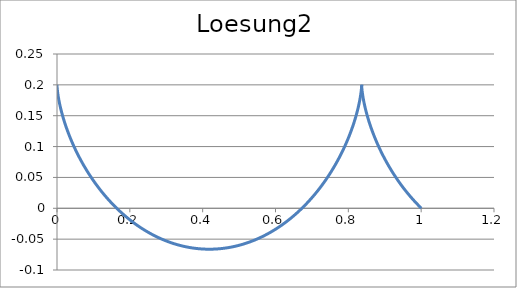
| Category | Loesung2 |
|---|---|
| 0.0 | 0.2 |
| 1.775264000021169e-07 | 0.2 |
| 1.420125989698755e-06 | 0.2 |
| 4.792445943709606e-06 | 0.2 |
| 1.1358281576902555e-05 | 0.2 |
| 2.218015084045884e-05 | 0.199 |
| 3.8318869328845375e-05 | 0.199 |
| 6.083312596773913e-05 | 0.199 |
| 9.077905955255315e-05 | 0.198 |
| 0.00012920983630701965 | 0.198 |
| 0.0001771752286307276 | 0.197 |
| 0.0002357211952041593 | 0.197 |
| 0.0003058894626191813 | 0.196 |
| 0.0003887171087022752 | 0.196 |
| 0.0004852361476972542 | 0.195 |
| 0.0005964731174733105 | 0.194 |
| 0.000723448668923555 | 0.193 |
| 0.0008671771577182861 | 0.192 |
| 0.001028666238576224 | 0.191 |
| 0.0012089164622160705 | 0.191 |
| 0.0014089208751495667 | 0.189 |
| 0.0016296646224761191 | 0.188 |
| 0.001872124553837883 | 0.187 |
| 0.0021372688326929696 | 0.186 |
| 0.0024260565490629243 | 0.185 |
| 0.0027394373359095506 | 0.184 |
| 0.00307835098929434 | 0.182 |
| 0.0034437270924726165 | 0.181 |
| 0.003836484644072635 | 0.18 |
| 0.004257531690508293 | 0.178 |
| 0.004707764962772832 | 0.177 |
| 0.005188069517758251 | 0.175 |
| 0.005699318384244411 | 0.174 |
| 0.006242372213699185 | 0.172 |
| 0.006818078936029271 | 0.17 |
| 0.0074272734204196365 | 0.169 |
| 0.008070777141396892 | 0.167 |
| 0.008749397850250458 | 0.165 |
| 0.00946392925194285 | 0.163 |
| 0.01021515068763823 | 0.162 |
| 0.011003826822976353 | 0.16 |
| 0.011830707342216529 | 0.158 |
| 0.012696526648373858 | 0.156 |
| 0.013602003569467884 | 0.154 |
| 0.014547841071000914 | 0.152 |
| 0.015534725974781224 | 0.15 |
| 0.01656332868420348 | 0.148 |
| 0.01763430291609631 | 0.145 |
| 0.018748285439244318 | 0.143 |
| 0.01990589581968904 | 0.141 |
| 0.02110773617291078 | 0.139 |
| 0.022354390922990457 | 0.137 |
| 0.02364642656884778 | 0.134 |
| 0.024984391457649194 | 0.132 |
| 0.02636881556547636 | 0.13 |
| 0.027800210285342783 | 0.127 |
| 0.02927906822264341 | 0.125 |
| 0.030805862998119046 | 0.122 |
| 0.03238104905841439 | 0.12 |
| 0.034005061494305405 | 0.118 |
| 0.03567831586666885 | 0.115 |
| 0.03740120804026339 | 0.113 |
| 0.03917411402538911 | 0.11 |
| 0.04099738982748824 | 0.108 |
| 0.04287137130474788 | 0.105 |
| 0.04479637403376107 | 0.102 |
| 0.046772693183300476 | 0.1 |
| 0.048800603396254714 | 0.097 |
| 0.05088035867977496 | 0.095 |
| 0.05301219230367537 | 0.092 |
| 0.05519631670712837 | 0.089 |
| 0.057432923413691724 | 0.087 |
| 0.059722182954701705 | 0.084 |
| 0.062064244801062866 | 0.082 |
| 0.06445923730346163 | 0.079 |
| 0.06690726764102771 | 0.076 |
| 0.06940842177846396 | 0.074 |
| 0.07196276443166155 | 0.071 |
| 0.07457033904181455 | 0.068 |
| 0.07723116775804398 | 0.066 |
| 0.07994525142853849 | 0.063 |
| 0.08271256960021504 | 0.06 |
| 0.08553308052689992 | 0.058 |
| 0.08840672118602673 | 0.055 |
| 0.09133340730384434 | 0.052 |
| 0.09431303338912551 | 0.05 |
| 0.09734547277536179 | 0.047 |
| 0.1004305776714286 | 0.044 |
| 0.10356817922069957 | 0.042 |
| 0.10675808756858698 | 0.039 |
| 0.11000009193848116 | 0.037 |
| 0.11329396071605814 | 0.034 |
| 0.11663944154192248 | 0.031 |
| 0.1200362614125475 | 0.029 |
| 0.12348412678947317 | 0.026 |
| 0.12698272371671757 | 0.024 |
| 0.13053171794635499 | 0.021 |
| 0.13413075507221078 | 0.019 |
| 0.13777946067161903 | 0.016 |
| 0.14147744045518656 | 0.014 |
| 0.14522428042450358 | 0.011 |
| 0.1490195470377375 | 0.009 |
| 0.15286278738304374 | 0.007 |
| 0.15675352935972464 | 0.004 |
| 0.16069128186706325 | 0.002 |
| 0.16467553500075716 | 0 |
| 0.16870576025687353 | -0.003 |
| 0.17278141074324335 | -0.005 |
| 0.17690192139821126 | -0.007 |
| 0.18106670921665252 | -0.009 |
| 0.18527517348316755 | -0.012 |
| 0.1895266960123596 | -0.014 |
| 0.19382064139610114 | -0.016 |
| 0.19815635725768832 | -0.018 |
| 0.20253317451278335 | -0.02 |
| 0.20695040763703873 | -0.022 |
| 0.21140735494029836 | -0.024 |
| 0.21590329884726395 | -0.026 |
| 0.22043750618451574 | -0.028 |
| 0.22500922847377205 | -0.03 |
| 0.22961770223127048 | -0.031 |
| 0.23426214927315148 | -0.033 |
| 0.23894177702672126 | -0.035 |
| 0.24365577884747047 | -0.037 |
| 0.24840333434172132 | -0.038 |
| 0.25318360969477377 | -0.04 |
| 0.25799575800442076 | -0.041 |
| 0.26283891961969735 | -0.043 |
| 0.26771222248473 | -0.044 |
| 0.27261478248754706 | -0.046 |
| 0.27754570381371185 | -0.047 |
| 0.2825040793046366 | -0.049 |
| 0.2874889908204336 | -0.05 |
| 0.292499509607159 | -0.051 |
| 0.29753469666830207 | -0.052 |
| 0.3025936031403711 | -0.054 |
| 0.3076752706724264 | -0.055 |
| 0.3127787318094077 | -0.056 |
| 0.3179030103791031 | -0.057 |
| 0.3230471218826058 | -0.058 |
| 0.32821007388809936 | -0.059 |
| 0.3333908664278179 | -0.059 |
| 0.3385884923980197 | -0.06 |
| 0.3438019379618154 | -0.061 |
| 0.349030182954689 | -0.062 |
| 0.35427220129255027 | -0.062 |
| 0.3595269613821545 | -0.063 |
| 0.36479342653372643 | -0.064 |
| 0.3700705553756218 | -0.064 |
| 0.3753573022708625 | -0.065 |
| 0.38065261773537745 | -0.065 |
| 0.385955448857782 | -0.065 |
| 0.3912647397205284 | -0.066 |
| 0.39657943182225913 | -0.066 |
| 0.40189846450119304 | -0.066 |
| 0.40722077535937584 | -0.066 |
| 0.41254530068762546 | -0.066 |
| 0.41787097589100114 | -0.066 |
| 0.4231967359146275 | -0.066 |
| 0.4285215156697021 | -0.066 |
| 0.43384425045951697 | -0.066 |
| 0.4391638764053229 | -0.066 |
| 0.44447933087186686 | -0.066 |
| 0.44978955289243183 | -0.065 |
| 0.45509348359320967 | -0.065 |
| 0.46039006661683596 | -0.065 |
| 0.46567824854491935 | -0.064 |
| 0.4709569793193947 | -0.064 |
| 0.4762252126625321 | -0.063 |
| 0.48148190649543443 | -0.063 |
| 0.48672602335485465 | -0.062 |
| 0.4919565308081677 | -0.061 |
| 0.4971724018663292 | -0.06 |
| 0.5023726153946577 | -0.06 |
| 0.5075561565212752 | -0.059 |
| 0.5127220170430418 | -0.058 |
| 0.5178691958288238 | -0.057 |
| 0.5229966992199332 | -0.056 |
| 0.528103541427577 | -0.055 |
| 0.5331887449271603 | -0.054 |
| 0.5382513408492832 | -0.053 |
| 0.5432903693672749 | -0.051 |
| 0.5483048800811123 | -0.05 |
| 0.5532939323975672 | -0.049 |
| 0.5582565959064305 | -0.047 |
| 0.5631919507526645 | -0.046 |
| 0.5680990880043325 | -0.045 |
| 0.5729771100161595 | -0.043 |
| 0.5778251307885777 | -0.042 |
| 0.5826422763221157 | -0.04 |
| 0.5874276849669859 | -0.038 |
| 0.5921805077677325 | -0.037 |
| 0.5968999088028034 | -0.035 |
| 0.6015850655189069 | -0.033 |
| 0.6062351690600224 | -0.032 |
| 0.6108494245909319 | -0.03 |
| 0.6154270516151434 | -0.028 |
| 0.6199672842870795 | -0.026 |
| 0.6244693717184048 | -0.024 |
| 0.6289325782783718 | -0.022 |
| 0.6333561838880629 | -0.02 |
| 0.6377394843084127 | -0.018 |
| 0.6420817914218945 | -0.016 |
| 0.646382433507757 | -0.014 |
| 0.6506407555107054 | -0.012 |
| 0.6548561193029127 | -0.01 |
| 0.6590279039392645 | -0.007 |
| 0.6631555059057267 | -0.005 |
| 0.6672383393607451 | -0.003 |
| 0.6712758363695721 | -0.001 |
| 0.6752674471314352 | 0.002 |
| 0.6792126401994477 | 0.004 |
| 0.6831109026931829 | 0.006 |
| 0.6869617405038165 | 0.009 |
| 0.6907646784917666 | 0.011 |
| 0.6945192606767407 | 0.013 |
| 0.6982250504201234 | 0.016 |
| 0.7018816305996247 | 0.018 |
| 0.7054886037761251 | 0.021 |
| 0.7090455923526435 | 0.023 |
| 0.7125522387253735 | 0.026 |
| 0.7160082054267184 | 0.028 |
| 0.7194131752602746 | 0.031 |
| 0.7227668514277054 | 0.034 |
| 0.726068957647457 | 0.036 |
| 0.7293192382652667 | 0.039 |
| 0.7325174583564218 | 0.041 |
| 0.7356634038197262 | 0.044 |
| 0.7387568814631377 | 0.047 |
| 0.7417977190810429 | 0.049 |
| 0.7447857655231361 | 0.052 |
| 0.7477208907548788 | 0.055 |
| 0.7506029859095105 | 0.057 |
| 0.7534319633315946 | 0.06 |
| 0.7562077566120793 | 0.063 |
| 0.7589303206148607 | 0.065 |
| 0.7615996314948357 | 0.068 |
| 0.7642156867074404 | 0.071 |
| 0.7667785050096683 | 0.073 |
| 0.7692881264525665 | 0.076 |
| 0.7717446123652172 | 0.079 |
| 0.7741480453302058 | 0.081 |
| 0.7764985291505894 | 0.084 |
| 0.7787961888083772 | 0.086 |
| 0.781041170414539 | 0.089 |
| 0.783233641150563 | 0.092 |
| 0.7853737892015853 | 0.094 |
| 0.7874618236811182 | 0.097 |
| 0.7894979745474077 | 0.099 |
| 0.7914824925114538 | 0.102 |
| 0.7934156489367283 | 0.105 |
| 0.7952977357306344 | 0.107 |
| 0.7971290652277464 | 0.11 |
| 0.7989099700648808 | 0.112 |
| 0.8006408030480457 | 0.115 |
| 0.8023219370113233 | 0.117 |
| 0.8039537646677406 | 0.12 |
| 0.8055366984521908 | 0.122 |
| 0.8070711703564633 | 0.124 |
| 0.8085576317564536 | 0.127 |
| 0.8099965532316189 | 0.129 |
| 0.8113884243767523 | 0.132 |
| 0.8127337536061519 | 0.134 |
| 0.8140330679502609 | 0.136 |
| 0.8152869128448638 | 0.138 |
| 0.8164958519129183 | 0.141 |
| 0.8176604667391141 | 0.143 |
| 0.8187813566372463 | 0.145 |
| 0.8198591384104991 | 0.147 |
| 0.8208944461047307 | 0.149 |
| 0.8218879307548657 | 0.151 |
| 0.8228402601244879 | 0.153 |
| 0.8237521184387449 | 0.155 |
| 0.8246242061106671 | 0.157 |
| 0.825457239461011 | 0.159 |
| 0.8262519504317416 | 0.161 |
| 0.8270090862932642 | 0.163 |
| 0.8277294093455274 | 0.165 |
| 0.828413696613112 | 0.167 |
| 0.829062739534433 | 0.168 |
| 0.8296773436451732 | 0.17 |
| 0.8302583282560809 | 0.172 |
| 0.8308065261252562 | 0.173 |
| 0.831322783125058 | 0.175 |
| 0.831807957903768 | 0.177 |
| 0.8322629215421417 | 0.178 |
| 0.8326885572049872 | 0.179 |
| 0.8330857597879127 | 0.181 |
| 0.8334554355593788 | 0.182 |
| 0.8337985017982037 | 0.183 |
| 0.8341158864266638 | 0.185 |
| 0.8344085276393377 | 0.186 |
| 0.8346773735278398 | 0.187 |
| 0.834923381701597 | 0.188 |
| 0.8351475189048181 | 0.189 |
| 0.835350760629808 | 0.19 |
| 0.8355340907267843 | 0.191 |
| 0.8356985010103505 | 0.192 |
| 0.8358449908627835 | 0.193 |
| 0.8359745668342929 | 0.194 |
| 0.8360882422404161 | 0.195 |
| 0.836187036756704 | 0.195 |
| 0.8362719760108651 | 0.196 |
| 0.8363440911725282 | 0.197 |
| 0.8364044185407881 | 0.197 |
| 0.8364539991296998 | 0.198 |
| 0.8364938782518864 | 0.198 |
| 0.836525105100429 | 0.199 |
| 0.8365487323292021 | 0.199 |
| 0.8365658156318273 | 0.199 |
| 0.8365774133194092 | 0.2 |
| 0.8365845858972253 | 0.2 |
| 0.8365883956405378 | 0.2 |
| 0.8365899061696983 | 0.2 |
| 0.8365901820247131 | 0.2 |
| 0.8365902882394417 | 0.2 |
| 0.8365912899155974 | 0.2 |
| 0.8365942517967213 | 0.2 |
| 0.8366002378422981 | 0.2 |
| 0.8366103108021872 | 0.199 |
| 0.8366255317915371 | 0.199 |
| 0.8366469598663527 | 0.199 |
| 0.8366756515998877 | 0.198 |
| 0.8367126606600291 | 0.198 |
| 0.8367590373878443 | 0.197 |
| 0.8368158283774583 | 0.197 |
| 0.8368840760574303 | 0.196 |
| 0.8369648182737963 | 0.196 |
| 0.8370590878749441 | 0.195 |
| 0.8371679122984881 | 0.194 |
| 0.8372923131603076 | 0.193 |
| 0.8374333058459146 | 0.193 |
| 0.8375918991043123 | 0.192 |
| 0.8377690946445103 | 0.191 |
| 0.8379658867348525 | 0.19 |
| 0.8381832618053249 | 0.189 |
| 0.8384221980529952 | 0.187 |
| 0.8386836650507481 | 0.186 |
| 0.8389686233594685 | 0.185 |
| 0.8392780241438302 | 0.184 |
| 0.8396128087918427 | 0.183 |
| 0.8399739085383086 | 0.181 |
| 0.8403622440923415 | 0.18 |
| 0.8407787252690956 | 0.178 |
| 0.8412242506258507 | 0.177 |
| 0.8416997071026029 | 0.175 |
| 0.8422059696672982 | 0.174 |
| 0.8427439009658589 | 0.172 |
| 0.8433143509771357 | 0.171 |
| 0.843918156672928 | 0.169 |
| 0.8445561416832059 | 0.167 |
| 0.8452291159666695 | 0.165 |
| 0.8459378754867763 | 0.164 |
| 0.8466832018933661 | 0.162 |
| 0.8474658622100116 | 0.16 |
| 0.8482866085272195 | 0.158 |
| 0.8491461777016039 | 0.156 |
| 0.8500452910611537 | 0.154 |
| 0.850984654116711 | 0.152 |
| 0.851964956279776 | 0.15 |
| 0.852986870586752 | 0.148 |
| 0.8540510534297394 | 0.146 |
| 0.855158144293988 | 0.144 |
| 0.8563087655021108 | 0.141 |
| 0.8575035219651639 | 0.139 |
| 0.8587430009406897 | 0.137 |
| 0.8600277717978223 | 0.135 |
| 0.8613583857895466 | 0.132 |
| 0.8627353758322052 | 0.13 |
| 0.8641592562923385 | 0.128 |
| 0.8656305227809451 | 0.125 |
| 0.8671496519552442 | 0.123 |
| 0.8687171013280185 | 0.12 |
| 0.8703333090846161 | 0.118 |
| 0.8719986939076814 | 0.115 |
| 0.8737136548096875 | 0.113 |
| 0.8754785709733378 | 0.11 |
| 0.8772938015998965 | 0.108 |
| 0.8791596857655134 | 0.105 |
| 0.8810765422855985 | 0.103 |
| 0.8830446695872992 | 0.1 |
| 0.8850643455901345 | 0.098 |
| 0.8871358275948291 | 0.095 |
| 0.8892593521803991 | 0.093 |
| 0.891435135109521 | 0.09 |
| 0.8936633712422312 | 0.087 |
| 0.895944234457984 | 0.085 |
| 0.8982778775861019 | 0.082 |
| 0.9006644323446465 | 0.079 |
| 0.9031040092877328 | 0.077 |
| 0.9055966977613082 | 0.074 |
| 0.908142565867417 | 0.071 |
| 0.9107416604369589 | 0.069 |
| 0.9133940070109584 | 0.066 |
| 0.9160996098303473 | 0.063 |
| 0.9188584518342706 | 0.061 |
| 0.9216704946669083 | 0.058 |
| 0.9245356786928189 | 0.055 |
| 0.9274539230207915 | 0.053 |
| 0.9304251255362027 | 0.05 |
| 0.9334491629418593 | 0.047 |
| 0.9365258908073171 | 0.045 |
| 0.93965514362665 | 0.042 |
| 0.9428367348846518 | 0.04 |
| 0.9460704571314369 | 0.037 |
| 0.9493560820654204 | 0.034 |
| 0.9526933606246346 | 0.032 |
| 0.9560820230863504 | 0.029 |
| 0.9595217791749618 | 0.027 |
| 0.9630123181780945 | 0.024 |
| 0.9665533090708851 | 0.022 |
| 0.970144400648387 | 0.019 |
| 0.9737852216660473 | 0.017 |
| 0.9774753809882006 | 0.014 |
| 0.9812144677445176 | 0.012 |
| 0.9850020514943475 | 0.009 |
| 0.9888376823988883 | 0.007 |
| 0.9927208914011174 | 0.005 |
| 0.9966511904134073 | 0.002 |
| 1.0006280725127543 | 0 |